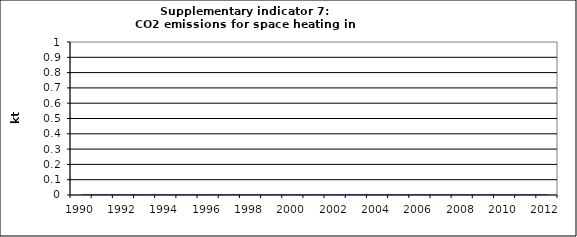
| Category | CO2 emissions for space heating in households, kt |
|---|---|
| 1990 | 0 |
| 1991 | 0 |
| 1992 | 0 |
| 1993 | 0 |
| 1994 | 0 |
| 1995 | 0 |
| 1996 | 0 |
| 1997 | 0 |
| 1998 | 0 |
| 1999 | 0 |
| 2000 | 0 |
| 2001 | 0 |
| 2002 | 0 |
| 2003 | 0 |
| 2004 | 0 |
| 2005 | 0 |
| 2006 | 0 |
| 2007 | 0 |
| 2008 | 0 |
| 2009 | 0 |
| 2010 | 0 |
| 2011 | 0 |
| 2012 | 0 |